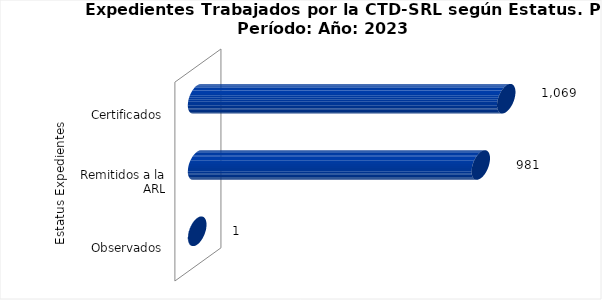
| Category | Total |
|---|---|
| 0 | 1 |
| 1 | 981 |
| 2 | 1069 |